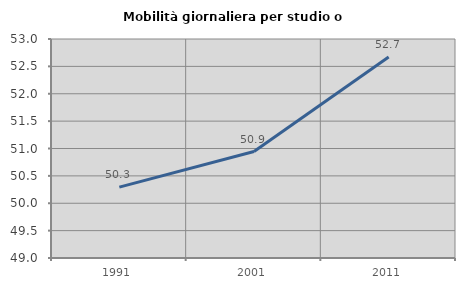
| Category | Mobilità giornaliera per studio o lavoro |
|---|---|
| 1991.0 | 50.295 |
| 2001.0 | 50.944 |
| 2011.0 | 52.67 |